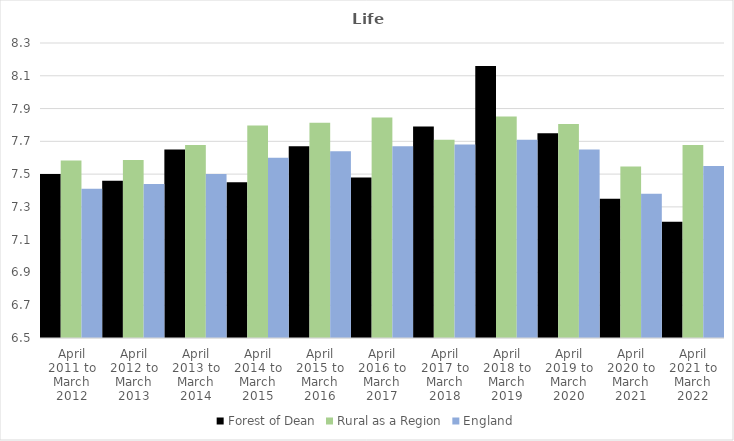
| Category | Forest of Dean | Rural as a Region | England |
|---|---|---|---|
| April 2011 to March 2012 | 7.5 | 7.584 | 7.41 |
| April 2012 to March 2013 | 7.46 | 7.586 | 7.44 |
| April 2013 to March 2014 | 7.65 | 7.677 | 7.5 |
| April 2014 to March 2015 | 7.45 | 7.797 | 7.6 |
| April 2015 to March 2016 | 7.67 | 7.813 | 7.64 |
| April 2016 to March 2017 | 7.48 | 7.845 | 7.67 |
| April 2017 to March 2018 | 7.79 | 7.71 | 7.68 |
| April 2018 to March 2019 | 8.16 | 7.852 | 7.71 |
| April 2019 to March 2020 | 7.75 | 7.806 | 7.65 |
| April 2020 to March 2021 | 7.35 | 7.546 | 7.38 |
| April 2021 to March 2022 | 7.21 | 7.677 | 7.55 |